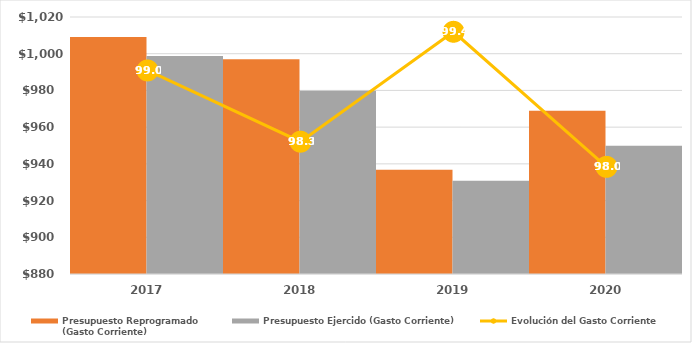
| Category | Presupuesto Reprogramado
(Gasto Corriente) | Presupuesto Ejercido (Gasto Corriente) |
|---|---|---|
| 2017.0 | 1009095.712 | 998802.519 |
| 2018.0 | 996966 | 979888 |
| 2019.0 | 936770.916 | 930739.308 |
| 2020.0 | 968900.978 | 949931.095 |